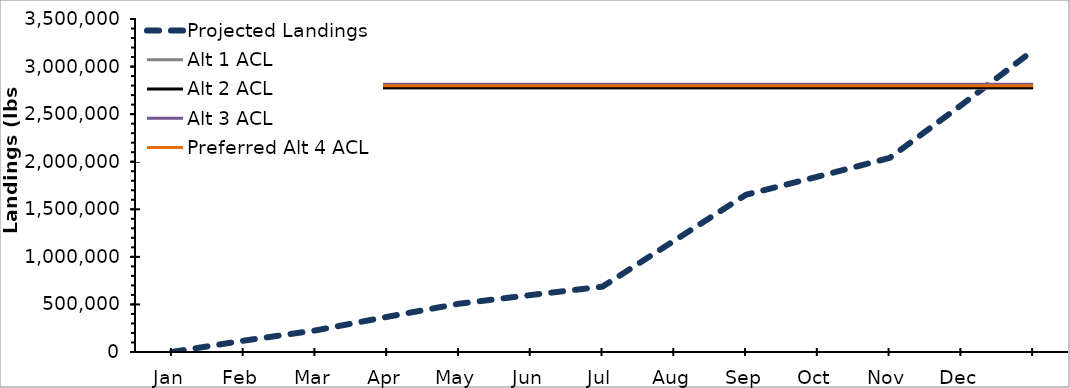
| Category | Projected Landings | Alt 1 ACL | Alt 2 ACL | Alt 3 ACL | Preferred Alt 4 ACL |
|---|---|---|---|---|---|
| Jan | 0 | 2771911 | 2779989 | 2814613 | 2798744 |
| Feb | 119094.376 | 2771911 | 2779989 | 2814613 | 2798744 |
| Mar | 226663.49 | 2771911 | 2779989 | 2814613 | 2798744 |
| Apr | 369511.267 | 2771911 | 2779989 | 2814613 | 2798744 |
| May | 507751.052 | 2771911 | 2779989 | 2814613 | 2798744 |
| Jun | 598781.76 | 2771911 | 2779989 | 2814613 | 2798744 |
| Jul | 686875.993 | 2771911 | 2779989 | 2814613 | 2798744 |
| Aug | 1170101.054 | 2771911 | 2779989 | 2814613 | 2798744 |
| Sep | 1653326.114 | 2771911 | 2779989 | 2814613 | 2798744 |
| Oct | 1843374.233 | 2771911 | 2779989 | 2814613 | 2798744 |
| Nov | 2039757.289 | 2771911 | 2779989 | 2814613 | 2798744 |
| Dec | 2595460.316 | 2771911 | 2779989 | 2814613 | 2798744 |